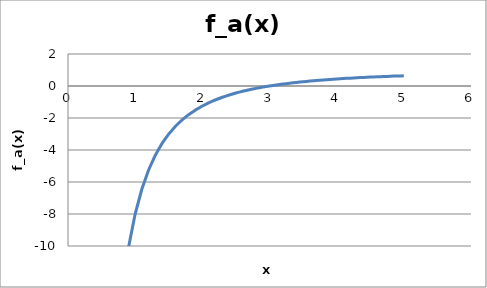
| Category | Series 0 |
|---|---|
| 0.1 | -899 |
| 0.2 | -224 |
| 0.3 | -99 |
| 0.4 | -55.25 |
| 0.5 | -35 |
| 0.6 | -24 |
| 0.7 | -17.367 |
| 0.8 | -13.062 |
| 0.9 | -10.111 |
| 1.0 | -8 |
| 1.1 | -6.438 |
| 1.2 | -5.25 |
| 1.3 | -4.325 |
| 1.4 | -3.592 |
| 1.5 | -3 |
| 1.6 | -2.516 |
| 1.7 | -2.114 |
| 1.8 | -1.778 |
| 1.9 | -1.493 |
| 2.0 | -1.25 |
| 2.1 | -1.041 |
| 2.2 | -0.86 |
| 2.3 | -0.701 |
| 2.4 | -0.562 |
| 2.5 | -0.44 |
| 2.6 | -0.331 |
| 2.7 | -0.235 |
| 2.8 | -0.148 |
| 2.9 | -0.07 |
| 3.0 | 0 |
| 3.1 | 0.063 |
| 3.2 | 0.121 |
| 3.3 | 0.174 |
| 3.4 | 0.221 |
| 3.5 | 0.265 |
| 3.6 | 0.306 |
| 3.7 | 0.343 |
| 3.8 | 0.377 |
| 3.9 | 0.408 |
| 4.0 | 0.438 |
| 4.1 | 0.465 |
| 4.2 | 0.49 |
| 4.3 | 0.513 |
| 4.4 | 0.535 |
| 4.5 | 0.556 |
| 4.6 | 0.575 |
| 4.7 | 0.593 |
| 4.8 | 0.609 |
| 4.9 | 0.625 |
| 5.0 | 0.64 |